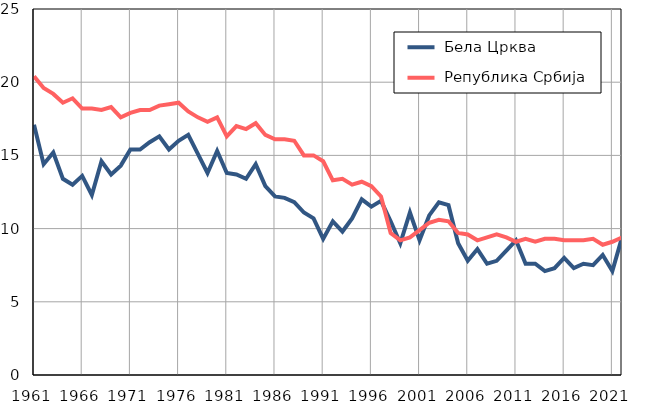
| Category |  Бела Црква |  Република Србија |
|---|---|---|
| 1961.0 | 17.1 | 20.4 |
| 1962.0 | 14.4 | 19.6 |
| 1963.0 | 15.2 | 19.2 |
| 1964.0 | 13.4 | 18.6 |
| 1965.0 | 13 | 18.9 |
| 1966.0 | 13.6 | 18.2 |
| 1967.0 | 12.3 | 18.2 |
| 1968.0 | 14.6 | 18.1 |
| 1969.0 | 13.7 | 18.3 |
| 1970.0 | 14.3 | 17.6 |
| 1971.0 | 15.4 | 17.9 |
| 1972.0 | 15.4 | 18.1 |
| 1973.0 | 15.9 | 18.1 |
| 1974.0 | 16.3 | 18.4 |
| 1975.0 | 15.4 | 18.5 |
| 1976.0 | 16 | 18.6 |
| 1977.0 | 16.4 | 18 |
| 1978.0 | 15.1 | 17.6 |
| 1979.0 | 13.8 | 17.3 |
| 1980.0 | 15.3 | 17.6 |
| 1981.0 | 13.8 | 16.3 |
| 1982.0 | 13.7 | 17 |
| 1983.0 | 13.4 | 16.8 |
| 1984.0 | 14.4 | 17.2 |
| 1985.0 | 12.9 | 16.4 |
| 1986.0 | 12.2 | 16.1 |
| 1987.0 | 12.1 | 16.1 |
| 1988.0 | 11.8 | 16 |
| 1989.0 | 11.1 | 15 |
| 1990.0 | 10.7 | 15 |
| 1991.0 | 9.3 | 14.6 |
| 1992.0 | 10.5 | 13.3 |
| 1993.0 | 9.8 | 13.4 |
| 1994.0 | 10.7 | 13 |
| 1995.0 | 12 | 13.2 |
| 1996.0 | 11.5 | 12.9 |
| 1997.0 | 11.9 | 12.2 |
| 1998.0 | 10.5 | 9.7 |
| 1999.0 | 9 | 9.2 |
| 2000.0 | 11.1 | 9.4 |
| 2001.0 | 9.2 | 9.9 |
| 2002.0 | 10.9 | 10.4 |
| 2003.0 | 11.8 | 10.6 |
| 2004.0 | 11.6 | 10.5 |
| 2005.0 | 9 | 9.7 |
| 2006.0 | 7.8 | 9.6 |
| 2007.0 | 8.6 | 9.2 |
| 2008.0 | 7.6 | 9.4 |
| 2009.0 | 7.8 | 9.6 |
| 2010.0 | 8.5 | 9.4 |
| 2011.0 | 9.2 | 9.1 |
| 2012.0 | 7.6 | 9.3 |
| 2013.0 | 7.6 | 9.1 |
| 2014.0 | 7.1 | 9.3 |
| 2015.0 | 7.3 | 9.3 |
| 2016.0 | 8 | 9.2 |
| 2017.0 | 7.3 | 9.2 |
| 2018.0 | 7.6 | 9.2 |
| 2019.0 | 7.5 | 9.3 |
| 2020.0 | 8.2 | 8.9 |
| 2021.0 | 7.1 | 9.1 |
| 2022.0 | 9.4 | 9.4 |